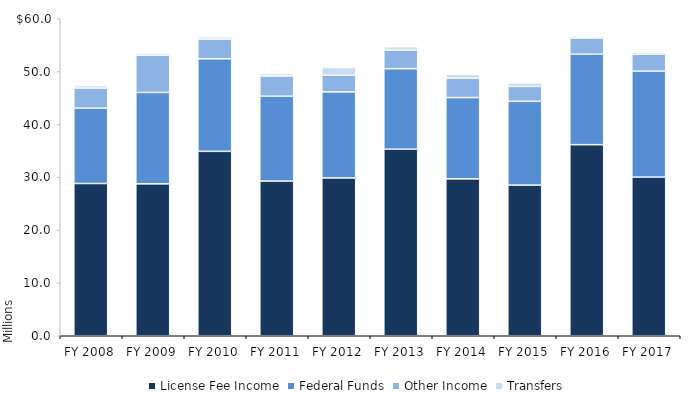
| Category | License Fee Income | Federal Funds | Other Income | Transfers |
|---|---|---|---|---|
| FY 2008 | 28816591 | 14257860 | 3805844 | 456899 |
| FY 2009 | 28751689 | 17296250 | 7035987 | 353162 |
| FY 2010 | 34905970 | 17515889 | 3737148 | 424614 |
| FY 2011 | 29277258 | 16063081 | 3830031 | 448116 |
| FY 2012 | 29871098 | 16292407 | 3145207 | 1446460 |
| FY 2013 | 35309134 | 15242894 | 3516140 | 638501 |
| FY 2014 | 29694990 | 15387516 | 3680948 | 671331 |
| FY 2015 | 28514480.39 | 15857086.86 | 2825119 | 647293 |
| FY 2016 | 36166442 | 17116031 | 3071168 | 360575 |
| FY 2017 | 30020259 | 20053079.52 | 3209960 | 385479 |